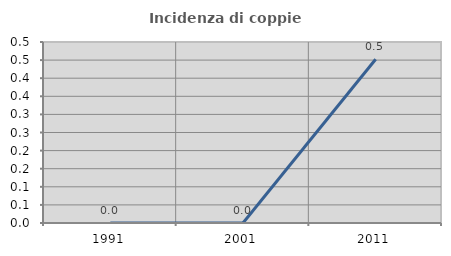
| Category | Incidenza di coppie miste |
|---|---|
| 1991.0 | 0 |
| 2001.0 | 0 |
| 2011.0 | 0.452 |